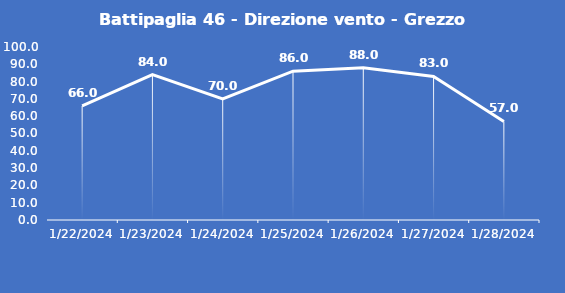
| Category | Battipaglia 46 - Direzione vento - Grezzo (°N) |
|---|---|
| 1/22/24 | 66 |
| 1/23/24 | 84 |
| 1/24/24 | 70 |
| 1/25/24 | 86 |
| 1/26/24 | 88 |
| 1/27/24 | 83 |
| 1/28/24 | 57 |